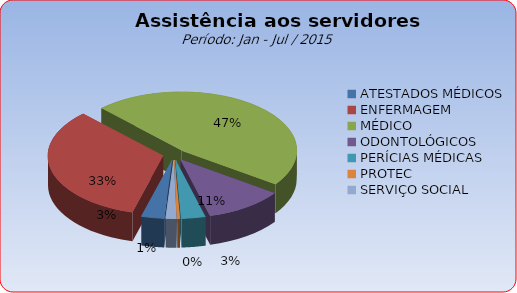
| Category | Series 0 |
|---|---|
| ATESTADOS MÉDICOS | 3.182 |
| ENFERMAGEM | 33.481 |
| MÉDICO | 47.028 |
| ODONTOLÓGICOS | 11.072 |
| PERÍCIAS MÉDICAS | 3.359 |
| PROTEC | 0.398 |
| SERVIÇO SOCIAL | 1.481 |